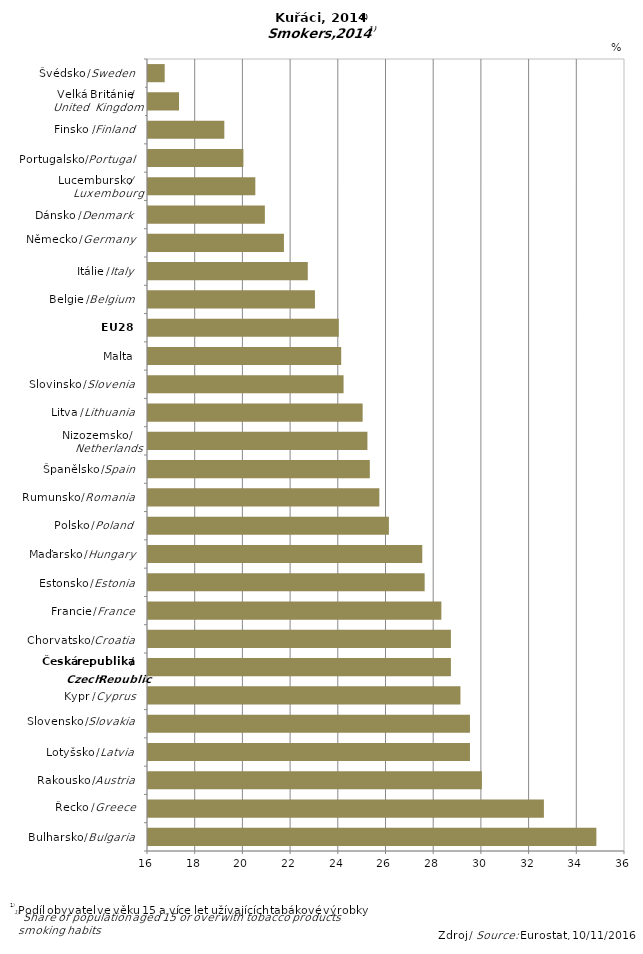
| Category | TOTAL |
|---|---|
|  | 34.8 |
|  | 32.6 |
|  | 30 |
|  | 29.5 |
|  | 29.5 |
|  | 29.1 |
|  | 28.7 |
|  | 28.7 |
|  | 28.3 |
|  | 27.6 |
|  | 27.5 |
|  | 26.1 |
|  | 25.7 |
|  | 25.3 |
|  | 25.2 |
|  | 25 |
|  | 24.2 |
|  | 24.1 |
|  | 24 |
|  | 23 |
|  | 22.7 |
|  | 21.7 |
|  | 20.9 |
|  | 20.5 |
|  | 20 |
|  | 19.2 |
|  | 17.3 |
|  | 16.7 |